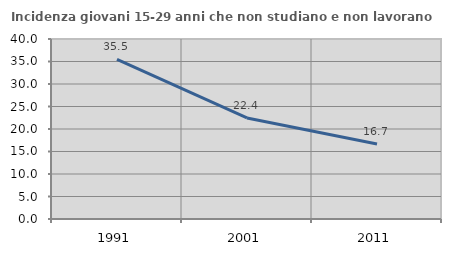
| Category | Incidenza giovani 15-29 anni che non studiano e non lavorano  |
|---|---|
| 1991.0 | 35.468 |
| 2001.0 | 22.449 |
| 2011.0 | 16.667 |